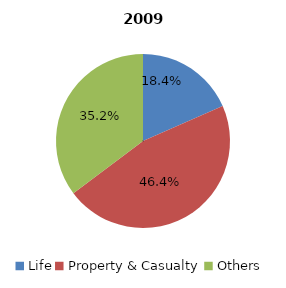
| Category | 2009 |
|---|---|
| Life | 202459194 |
| Property & Casualty | 509273878 |
| Others | 387251707 |